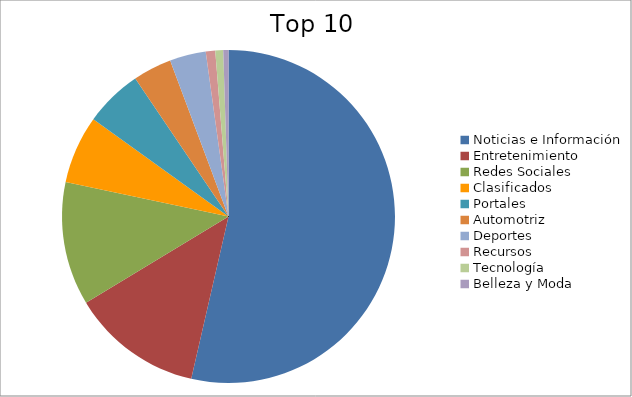
| Category | Series 0 |
|---|---|
| Noticias e Información | 53.15 |
| Entretenimiento | 12.64 |
| Redes Sociales | 11.88 |
| Clasificados | 6.55 |
| Portales | 5.57 |
| Automotriz | 3.73 |
| Deportes | 3.48 |
| Recursos | 0.91 |
| Tecnología | 0.76 |
| Belleza y Moda | 0.5 |